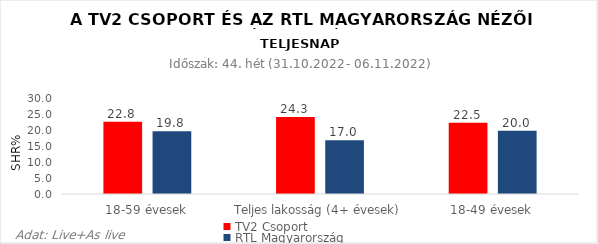
| Category | TV2 Csoport | RTL Magyarország |
|---|---|---|
| 18-59 évesek | 22.8 | 19.8 |
| Teljes lakosság (4+ évesek) | 24.3 | 17 |
| 18-49 évesek | 22.5 | 20 |